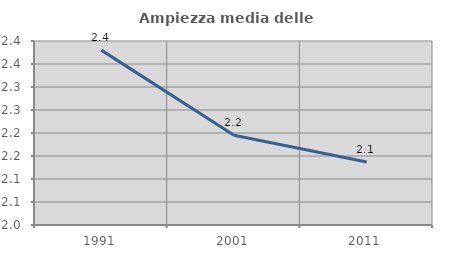
| Category | Ampiezza media delle famiglie |
|---|---|
| 1991.0 | 2.38 |
| 2001.0 | 2.195 |
| 2011.0 | 2.137 |